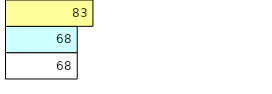
| Category | Total Standouts | Total Recd | Total Tipsters |
|---|---|---|---|
| 0 | 68 | 68 | 83 |